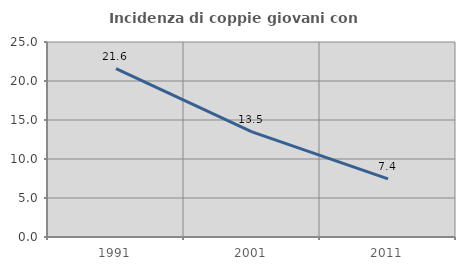
| Category | Incidenza di coppie giovani con figli |
|---|---|
| 1991.0 | 21.59 |
| 2001.0 | 13.478 |
| 2011.0 | 7.45 |